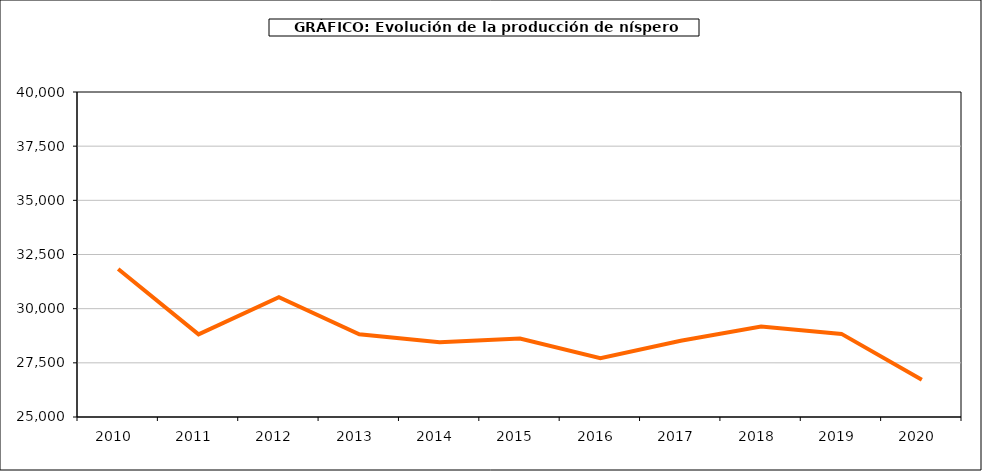
| Category | producción níspero |
|---|---|
| 2010.0 | 31834 |
| 2011.0 | 28812 |
| 2012.0 | 30529 |
| 2013.0 | 28815 |
| 2014.0 | 28449 |
| 2015.0 | 28620 |
| 2016.0 | 27712 |
| 2017.0 | 28522 |
| 2018.0 | 29173 |
| 2019.0 | 28836 |
| 2020.0 | 26717 |